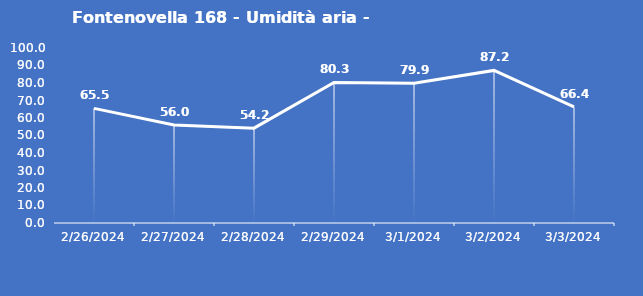
| Category | Fontenovella 168 - Umidità aria - Grezzo (%) |
|---|---|
| 2/26/24 | 65.5 |
| 2/27/24 | 56 |
| 2/28/24 | 54.2 |
| 2/29/24 | 80.3 |
| 3/1/24 | 79.9 |
| 3/2/24 | 87.2 |
| 3/3/24 | 66.4 |